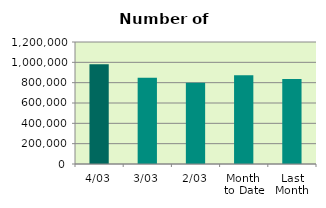
| Category | Series 0 |
|---|---|
| 4/03 | 981244 |
| 3/03 | 847648 |
| 2/03 | 799304 |
| Month 
to Date | 873869 |
| Last
Month | 836497.7 |